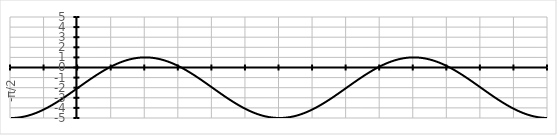
| Category | Series 0 |
|---|---|
| -π/2 | -5 |
|  | -5 |
|  | -4.998 |
|  | -4.996 |
|  | -4.993 |
|  | -4.989 |
|  | -4.984 |
|  | -4.978 |
|  | -4.971 |
|  | -4.963 |
|  | -4.954 |
|  | -4.945 |
|  | -4.934 |
|  | -4.923 |
|  | -4.911 |
|  | -4.898 |
|  | -4.884 |
|  | -4.869 |
|  | -4.853 |
|  | -4.837 |
|  | -4.819 |
|  | -4.801 |
|  | -4.782 |
|  | -4.762 |
|  | -4.741 |
|  | -4.719 |
|  | -4.696 |
|  | -4.673 |
|  | -4.649 |
|  | -4.624 |
|  | -4.598 |
|  | -4.572 |
|  | -4.544 |
|  | -4.516 |
|  | -4.487 |
|  | -4.457 |
|  | -4.427 |
|  | -4.396 |
|  | -4.364 |
|  | -4.331 |
|  | -4.298 |
|  | -4.264 |
|  | -4.229 |
|  | -4.194 |
|  | -4.158 |
|   | -4.121 |
|  | -4.084 |
|  | -4.046 |
|  | -4.007 |
|  | -3.968 |
|  | -3.928 |
|  | -3.888 |
|  | -3.847 |
|  | -3.805 |
|  | -3.763 |
|  | -3.721 |
|  | -3.678 |
|  | -3.634 |
|  | -3.59 |
|  | -3.545 |
|  | -3.5 |
|  | -3.454 |
|  | -3.408 |
|  | -3.362 |
|  | -3.315 |
|  | -3.268 |
|  | -3.22 |
|  | -3.172 |
|  | -3.124 |
|  | -3.075 |
|  | -3.026 |
|  | -2.977 |
|  | -2.927 |
|  | -2.877 |
|  | -2.827 |
|  | -2.776 |
|  | -2.726 |
|  | -2.675 |
|  | -2.624 |
|  | -2.572 |
|  | -2.521 |
|  | -2.469 |
|  | -2.418 |
|  | -2.366 |
|  | -2.314 |
|  | -2.261 |
|  | -2.209 |
|  | -2.157 |
|  | -2.105 |
|  | -2.052 |
| 0 | -2 |
|  | -1.948 |
|  | -1.895 |
|  | -1.843 |
|  | -1.791 |
|  | -1.739 |
|  | -1.686 |
|  | -1.634 |
|  | -1.582 |
|  | -1.531 |
|  | -1.479 |
|  | -1.428 |
|  | -1.376 |
|  | -1.325 |
|  | -1.274 |
|  | -1.224 |
|  | -1.173 |
|  | -1.123 |
|  | -1.073 |
|  | -1.023 |
|  | -0.974 |
|  | -0.925 |
|  | -0.876 |
|  | -0.828 |
|  | -0.78 |
|  | -0.732 |
|  | -0.685 |
|  | -0.638 |
|  | -0.592 |
|  | -0.546 |
|  | -0.5 |
|  | -0.455 |
|  | -0.41 |
|  | -0.366 |
|  | -0.322 |
|  | -0.279 |
|  | -0.237 |
|  | -0.195 |
|  | -0.153 |
|  | -0.112 |
|  | -0.072 |
|  | -0.032 |
|  | 0.007 |
|  | 0.046 |
|  | 0.084 |
|   | 0.121 |
|  | 0.158 |
|  | 0.194 |
|  | 0.229 |
|  | 0.264 |
|  | 0.298 |
|  | 0.331 |
|  | 0.364 |
|  | 0.396 |
|  | 0.427 |
|  | 0.457 |
|  | 0.487 |
|  | 0.516 |
|  | 0.544 |
|  | 0.572 |
|  | 0.598 |
|  | 0.624 |
|  | 0.649 |
|  | 0.673 |
|  | 0.696 |
|  | 0.719 |
|  | 0.741 |
|  | 0.762 |
|  | 0.782 |
|  | 0.801 |
|  | 0.819 |
|  | 0.837 |
|  | 0.853 |
|  | 0.869 |
|  | 0.884 |
|  | 0.898 |
|  | 0.911 |
|  | 0.923 |
|  | 0.934 |
|  | 0.945 |
|  | 0.954 |
|  | 0.963 |
|  | 0.971 |
|  | 0.978 |
|  | 0.984 |
|  | 0.989 |
|  | 0.993 |
|  | 0.996 |
|  | 0.998 |
|  | 1 |
| π/2 | 1 |
|  | 1 |
|  | 0.998 |
|  | 0.996 |
|  | 0.993 |
|  | 0.989 |
|  | 0.984 |
|  | 0.978 |
|  | 0.971 |
|  | 0.963 |
|  | 0.954 |
|  | 0.945 |
|  | 0.934 |
|  | 0.923 |
|  | 0.911 |
|  | 0.898 |
|  | 0.884 |
|  | 0.869 |
|  | 0.853 |
|  | 0.837 |
|  | 0.819 |
|  | 0.801 |
|  | 0.782 |
|  | 0.762 |
|  | 0.741 |
|  | 0.719 |
|  | 0.696 |
|  | 0.673 |
|  | 0.649 |
|  | 0.624 |
|  | 0.598 |
|  | 0.572 |
|  | 0.544 |
|  | 0.516 |
|  | 0.487 |
|  | 0.457 |
|  | 0.427 |
|  | 0.396 |
|  | 0.364 |
|  | 0.331 |
|  | 0.298 |
|  | 0.264 |
|  | 0.229 |
|  | 0.194 |
|  | 0.158 |
|   | 0.121 |
|  | 0.084 |
|  | 0.046 |
|  | 0.007 |
|  | -0.032 |
|  | -0.072 |
|  | -0.112 |
|  | -0.153 |
|  | -0.195 |
|  | -0.237 |
|  | -0.279 |
|  | -0.322 |
|  | -0.366 |
|  | -0.41 |
|  | -0.455 |
|  | -0.5 |
|  | -0.546 |
|  | -0.592 |
|  | -0.638 |
|  | -0.685 |
|  | -0.732 |
|  | -0.78 |
|  | -0.828 |
|  | -0.876 |
|  | -0.925 |
|  | -0.974 |
|  | -1.023 |
|  | -1.073 |
|  | -1.123 |
|  | -1.173 |
|  | -1.224 |
|  | -1.274 |
|  | -1.325 |
|  | -1.376 |
|  | -1.428 |
|  | -1.479 |
|  | -1.531 |
|  | -1.582 |
|  | -1.634 |
|  | -1.686 |
|  | -1.739 |
|  | -1.791 |
|  | -1.843 |
|  | -1.895 |
|  | -1.948 |
| π | -2 |
|  | -2.052 |
|  | -2.105 |
|  | -2.157 |
|  | -2.209 |
|  | -2.261 |
|  | -2.314 |
|  | -2.366 |
|  | -2.418 |
|  | -2.469 |
|  | -2.521 |
|  | -2.572 |
|  | -2.624 |
|  | -2.675 |
|  | -2.726 |
|  | -2.776 |
|  | -2.827 |
|  | -2.877 |
|  | -2.927 |
|  | -2.977 |
|  | -3.026 |
|  | -3.075 |
|  | -3.124 |
|  | -3.172 |
|  | -3.22 |
|  | -3.268 |
|  | -3.315 |
|  | -3.362 |
|  | -3.408 |
|  | -3.454 |
|  | -3.5 |
|  | -3.545 |
|  | -3.59 |
|  | -3.634 |
|  | -3.678 |
|  | -3.721 |
|  | -3.763 |
|  | -3.805 |
|  | -3.847 |
|  | -3.888 |
|  | -3.928 |
|  | -3.968 |
|  | -4.007 |
|  | -4.046 |
|  | -4.084 |
|   | -4.121 |
|  | -4.158 |
|  | -4.194 |
|  | -4.229 |
|  | -4.264 |
|  | -4.298 |
|  | -4.331 |
|  | -4.364 |
|  | -4.396 |
|  | -4.427 |
|  | -4.457 |
|  | -4.487 |
|  | -4.516 |
|  | -4.544 |
|  | -4.572 |
|  | -4.598 |
|  | -4.624 |
|  | -4.649 |
|  | -4.673 |
|  | -4.696 |
|  | -4.719 |
|  | -4.741 |
|  | -4.762 |
|  | -4.782 |
|  | -4.801 |
|  | -4.819 |
|  | -4.837 |
|  | -4.853 |
|  | -4.869 |
|  | -4.884 |
|  | -4.898 |
|  | -4.911 |
|  | -4.923 |
|  | -4.934 |
|  | -4.945 |
|  | -4.954 |
|  | -4.963 |
|  | -4.971 |
|  | -4.978 |
|  | -4.984 |
|  | -4.989 |
|  | -4.993 |
|  | -4.996 |
|  | -4.998 |
|  | -5 |
| 3π/2 | -5 |
|  | -5 |
|  | -4.998 |
|  | -4.996 |
|  | -4.993 |
|  | -4.989 |
|  | -4.984 |
|  | -4.978 |
|  | -4.971 |
|  | -4.963 |
|  | -4.954 |
|  | -4.945 |
|  | -4.934 |
|  | -4.923 |
|  | -4.911 |
|  | -4.898 |
|  | -4.884 |
|  | -4.869 |
|  | -4.853 |
|  | -4.837 |
|  | -4.819 |
|  | -4.801 |
|  | -4.782 |
|  | -4.762 |
|  | -4.741 |
|  | -4.719 |
|  | -4.696 |
|  | -4.673 |
|  | -4.649 |
|  | -4.624 |
|  | -4.598 |
|  | -4.572 |
|  | -4.544 |
|  | -4.516 |
|  | -4.487 |
|  | -4.457 |
|  | -4.427 |
|  | -4.396 |
|  | -4.364 |
|  | -4.331 |
|  | -4.298 |
|  | -4.264 |
|  | -4.229 |
|  | -4.194 |
|  | -4.158 |
|   | -4.121 |
|  | -4.084 |
|  | -4.046 |
|  | -4.007 |
|  | -3.968 |
|  | -3.928 |
|  | -3.888 |
|  | -3.847 |
|  | -3.805 |
|  | -3.763 |
|  | -3.721 |
|  | -3.678 |
|  | -3.634 |
|  | -3.59 |
|  | -3.545 |
|  | -3.5 |
|  | -3.454 |
|  | -3.408 |
|  | -3.362 |
|  | -3.315 |
|  | -3.268 |
|  | -3.22 |
|  | -3.172 |
|  | -3.124 |
|  | -3.075 |
|  | -3.026 |
|  | -2.977 |
|  | -2.927 |
|  | -2.877 |
|  | -2.827 |
|  | -2.776 |
|  | -2.726 |
|  | -2.675 |
|  | -2.624 |
|  | -2.572 |
|  | -2.521 |
|  | -2.469 |
|  | -2.418 |
|  | -2.366 |
|  | -2.314 |
|  | -2.261 |
|  | -2.209 |
|  | -2.157 |
|  | -2.105 |
|  | -2.052 |
| 2π | -2 |
|  | -1.948 |
|  | -1.895 |
|  | -1.843 |
|  | -1.791 |
|  | -1.739 |
|  | -1.686 |
|  | -1.634 |
|  | -1.582 |
|  | -1.531 |
|  | -1.479 |
|  | -1.428 |
|  | -1.376 |
|  | -1.325 |
|  | -1.274 |
|  | -1.224 |
|  | -1.173 |
|  | -1.123 |
|  | -1.073 |
|  | -1.023 |
|  | -0.974 |
|  | -0.925 |
|  | -0.876 |
|  | -0.828 |
|  | -0.78 |
|  | -0.732 |
|  | -0.685 |
|  | -0.638 |
|  | -0.592 |
|  | -0.546 |
|  | -0.5 |
|  | -0.455 |
|  | -0.41 |
|  | -0.366 |
|  | -0.322 |
|  | -0.279 |
|  | -0.237 |
|  | -0.195 |
|  | -0.153 |
|  | -0.112 |
|  | -0.072 |
|  | -0.032 |
|  | 0.007 |
|  | 0.046 |
|  | 0.084 |
|   | 0.121 |
|  | 0.158 |
|  | 0.194 |
|  | 0.229 |
|  | 0.264 |
|  | 0.298 |
|  | 0.331 |
|  | 0.364 |
|  | 0.396 |
|  | 0.427 |
|  | 0.457 |
|  | 0.487 |
|  | 0.516 |
|  | 0.544 |
|  | 0.572 |
|  | 0.598 |
|  | 0.624 |
|  | 0.649 |
|  | 0.673 |
|  | 0.696 |
|  | 0.719 |
|  | 0.741 |
|  | 0.762 |
|  | 0.782 |
|  | 0.801 |
|  | 0.819 |
|  | 0.837 |
|  | 0.853 |
|  | 0.869 |
|  | 0.884 |
|  | 0.898 |
|  | 0.911 |
|  | 0.923 |
|  | 0.934 |
|  | 0.945 |
|  | 0.954 |
|  | 0.963 |
|  | 0.971 |
|  | 0.978 |
|  | 0.984 |
|  | 0.989 |
|  | 0.993 |
|  | 0.996 |
|  | 0.998 |
|  | 1 |
| 5π/2 | 1 |
|  | 1 |
|  | 0.998 |
|  | 0.996 |
|  | 0.993 |
|  | 0.989 |
|  | 0.984 |
|  | 0.978 |
|  | 0.971 |
|  | 0.963 |
|  | 0.954 |
|  | 0.945 |
|  | 0.934 |
|  | 0.923 |
|  | 0.911 |
|  | 0.898 |
|  | 0.884 |
|  | 0.869 |
|  | 0.853 |
|  | 0.837 |
|  | 0.819 |
|  | 0.801 |
|  | 0.782 |
|  | 0.762 |
|  | 0.741 |
|  | 0.719 |
|  | 0.696 |
|  | 0.673 |
|  | 0.649 |
|  | 0.624 |
|  | 0.598 |
|  | 0.572 |
|  | 0.544 |
|  | 0.516 |
|  | 0.487 |
|  | 0.457 |
|  | 0.427 |
|  | 0.396 |
|  | 0.364 |
|  | 0.331 |
|  | 0.298 |
|  | 0.264 |
|  | 0.229 |
|  | 0.194 |
|  | 0.158 |
|   | 0.121 |
|  | 0.084 |
|  | 0.046 |
|  | 0.007 |
|  | -0.032 |
|  | -0.072 |
|  | -0.112 |
|  | -0.153 |
|  | -0.195 |
|  | -0.237 |
|  | -0.279 |
|  | -0.322 |
|  | -0.366 |
|  | -0.41 |
|  | -0.455 |
|  | -0.5 |
|  | -0.546 |
|  | -0.592 |
|  | -0.638 |
|  | -0.685 |
|  | -0.732 |
|  | -0.78 |
|  | -0.828 |
|  | -0.876 |
|  | -0.925 |
|  | -0.974 |
|  | -1.023 |
|  | -1.073 |
|  | -1.123 |
|  | -1.173 |
|  | -1.224 |
|  | -1.274 |
|  | -1.325 |
|  | -1.376 |
|  | -1.428 |
|  | -1.479 |
|  | -1.531 |
|  | -1.582 |
|  | -1.634 |
|  | -1.686 |
|  | -1.739 |
|  | -1.791 |
|  | -1.843 |
|  | -1.895 |
|  | -1.948 |
| 3π | -2 |
|  | -2.052 |
|  | -2.105 |
|  | -2.157 |
|  | -2.209 |
|  | -2.261 |
|  | -2.314 |
|  | -2.366 |
|  | -2.418 |
|  | -2.469 |
|  | -2.521 |
|  | -2.572 |
|  | -2.624 |
|  | -2.675 |
|  | -2.726 |
|  | -2.776 |
|  | -2.827 |
|  | -2.877 |
|  | -2.927 |
|  | -2.977 |
|  | -3.026 |
|  | -3.075 |
|  | -3.124 |
|  | -3.172 |
|  | -3.22 |
|  | -3.268 |
|  | -3.315 |
|  | -3.362 |
|  | -3.408 |
|  | -3.454 |
|  | -3.5 |
|  | -3.545 |
|  | -3.59 |
|  | -3.634 |
|  | -3.678 |
|  | -3.721 |
|  | -3.763 |
|  | -3.805 |
|  | -3.847 |
|  | -3.888 |
|  | -3.928 |
|  | -3.968 |
|  | -4.007 |
|  | -4.046 |
|  | -4.084 |
|   | -4.121 |
|  | -4.158 |
|  | -4.194 |
|  | -4.229 |
|  | -4.264 |
|  | -4.298 |
|  | -4.331 |
|  | -4.364 |
|  | -4.396 |
|  | -4.427 |
|  | -4.457 |
|  | -4.487 |
|  | -4.516 |
|  | -4.544 |
|  | -4.572 |
|  | -4.598 |
|  | -4.624 |
|  | -4.649 |
|  | -4.673 |
|  | -4.696 |
|  | -4.719 |
|  | -4.741 |
|  | -4.762 |
|  | -4.782 |
|  | -4.801 |
|  | -4.819 |
|  | -4.837 |
|  | -4.853 |
|  | -4.869 |
|  | -4.884 |
|  | -4.898 |
|  | -4.911 |
|  | -4.923 |
|  | -4.934 |
|  | -4.945 |
|  | -4.954 |
|  | -4.963 |
|  | -4.971 |
|  | -4.978 |
|  | -4.984 |
|  | -4.989 |
|  | -4.993 |
|  | -4.996 |
|  | -4.998 |
|  | -5 |
| 7π/2 | -5 |